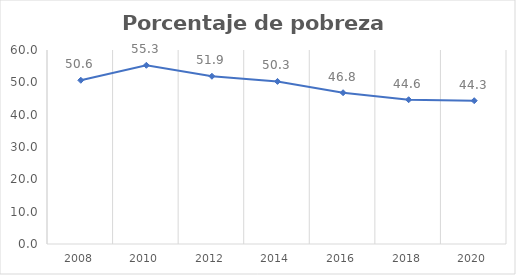
| Category | Series 0 |
|---|---|
| 2008.0 | 50.641 |
| 2010.0 | 55.27 |
| 2012.0 | 51.877 |
| 2014.0 | 50.285 |
| 2016.0 | 46.788 |
| 2018.0 | 44.62 |
| 2020.0 | 44.318 |